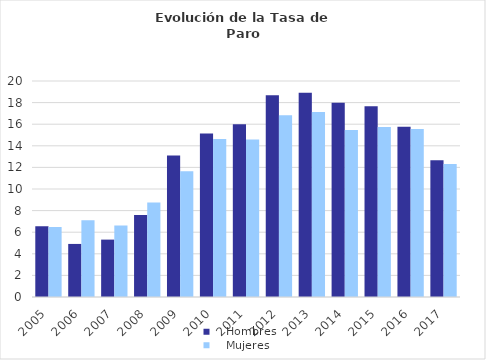
| Category |    Hombres |    Mujeres |
|---|---|---|
| 2005.0 | 6.549 | 6.487 |
| 2006.0 | 4.914 | 7.116 |
| 2007.0 | 5.314 | 6.627 |
| 2008.0 | 7.603 | 8.745 |
| 2009.0 | 13.103 | 11.642 |
| 2010.0 | 15.129 | 14.634 |
| 2011.0 | 16.003 | 14.573 |
| 2012.0 | 18.686 | 16.837 |
| 2013.0 | 18.911 | 17.138 |
| 2014.0 | 17.993 | 15.457 |
| 2015.0 | 17.67 | 15.732 |
| 2016.0 | 15.756 | 15.553 |
| 2017.0 | 12.651 | 12.313 |